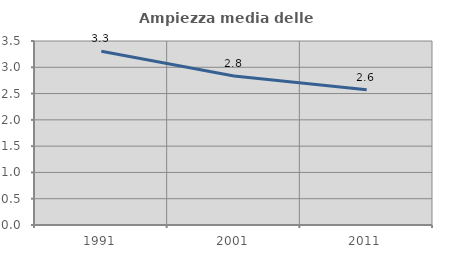
| Category | Ampiezza media delle famiglie |
|---|---|
| 1991.0 | 3.306 |
| 2001.0 | 2.833 |
| 2011.0 | 2.574 |